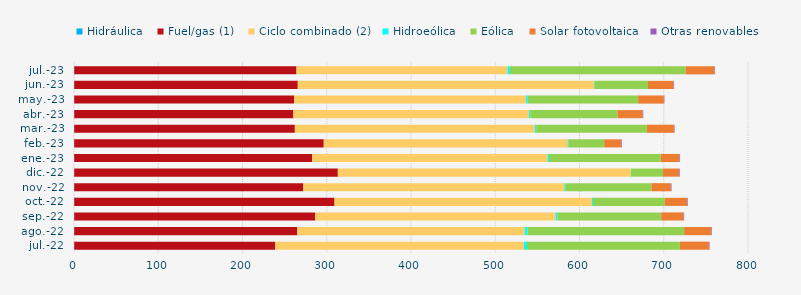
| Category | Hidráulica | Fuel/gas (1) | Ciclo combinado (2) | Hidroeólica | Eólica | Solar fotovoltaica | Otras renovables |
|---|---|---|---|---|---|---|---|
| jul.-22 | 0.294 | 238.315 | 295.517 | 3.563 | 181.499 | 34.435 | 0.688 |
| ago.-22 | 0.293 | 264.802 | 269.791 | 3.518 | 185.783 | 32.263 | 0.715 |
| sep.-22 | 0.289 | 286.046 | 285.298 | 2.075 | 123.261 | 26.539 | 0.715 |
| oct.-22 | 0.294 | 308.951 | 305.386 | 1.35 | 85.079 | 26.753 | 0.731 |
| nov.-22 | 0.277 | 271.883 | 309.743 | 1.169 | 102.221 | 23.169 | 0.765 |
| dic.-22 | 0.289 | 312.877 | 347.662 | 0.367 | 37.913 | 19.007 | 0.785 |
| ene.-23 | 0.275 | 282.444 | 279.419 | 1.65 | 132.728 | 22.065 | 0.784 |
| feb.-23 | 0.254 | 296.204 | 289.333 | 0.829 | 42.685 | 20.223 | 0.711 |
| mar.-23 | 0.29 | 261.841 | 284.831 | 1.572 | 131.438 | 32.126 | 0.738 |
| abr.-23 | 0.276 | 260.1 | 279.544 | 1.573 | 103.685 | 29.89 | 0.631 |
| may.-23 | 0.298 | 261.008 | 275.341 | 2.067 | 130.95 | 30.463 | 0.651 |
| jun.-23 | 0.284 | 265.329 | 351.459 | 0.809 | 63.396 | 30.367 | 0.665 |
| jul.-23 | 0.302 | 263.817 | 250.521 | 2.759 | 208.494 | 34.305 | 0.646 |